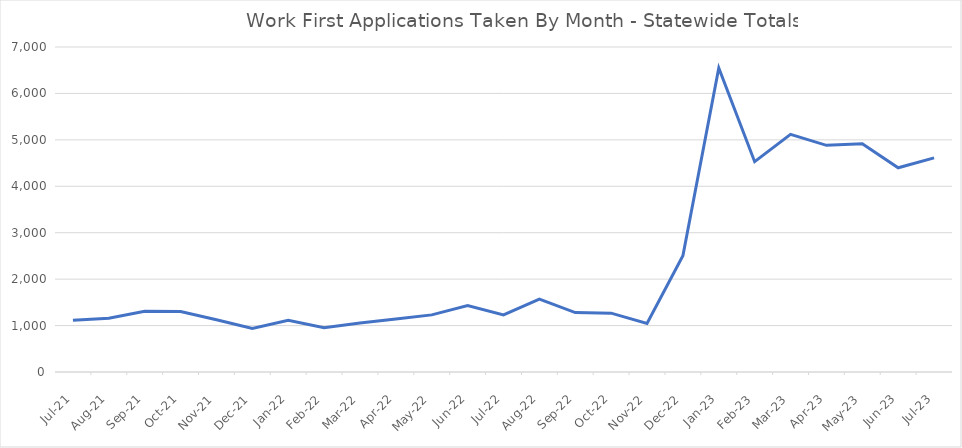
| Category | Series 0 |
|---|---|
| 2023-07-23 | 4613 |
| 2023-06-23 | 4398 |
| 2023-05-23 | 4918 |
| 2023-04-23 | 4882 |
| 2023-03-23 | 5117 |
| 2023-02-01 | 4530 |
| 2023-01-01 | 6546 |
| 2022-12-01 | 2505 |
| 2022-11-22 | 1044 |
| 2022-10-22 | 1268 |
| 2022-09-22 | 1279 |
| 2022-08-22 | 1568 |
| 2022-07-22 | 1228 |
| 2022-06-01 | 1433 |
| 2022-05-01 | 1230 |
| 2022-04-01 | 1142 |
| 2022-03-01 | 1056 |
| 2022-02-01 | 953 |
| 2022-01-01 | 1113 |
| 2021-12-02 | 940 |
| 2021-11-01 | 1127 |
| 2021-10-01 | 1301 |
| 2021-09-01 | 1308 |
| 2021-08-01 | 1156 |
| 2021-07-01 | 1115 |